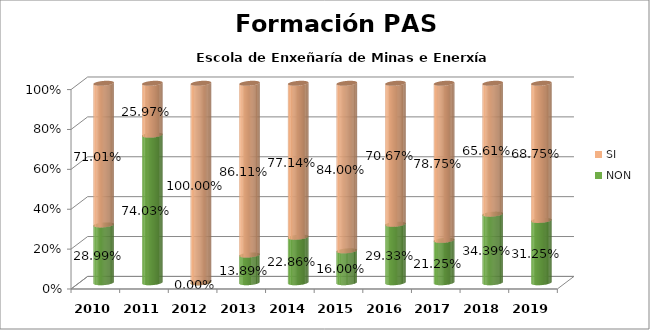
| Category | NON | SI |
|---|---|---|
| 2010.0 | 0.29 | 0.71 |
| 2011.0 | 0.74 | 0.26 |
| 2012.0 | 0 | 1 |
| 2013.0 | 0.139 | 0.861 |
| 2014.0 | 0.229 | 0.771 |
| 2015.0 | 0.16 | 0.84 |
| 2016.0 | 0.293 | 0.707 |
| 2017.0 | 0.213 | 0.788 |
| 2018.0 | 0.344 | 0.656 |
| 2019.0 | 0.312 | 0.688 |